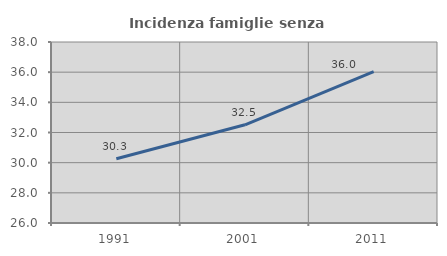
| Category | Incidenza famiglie senza nuclei |
|---|---|
| 1991.0 | 30.258 |
| 2001.0 | 32.512 |
| 2011.0 | 36.032 |